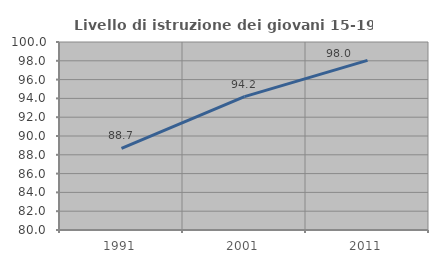
| Category | Livello di istruzione dei giovani 15-19 anni |
|---|---|
| 1991.0 | 88.696 |
| 2001.0 | 94.186 |
| 2011.0 | 98.039 |